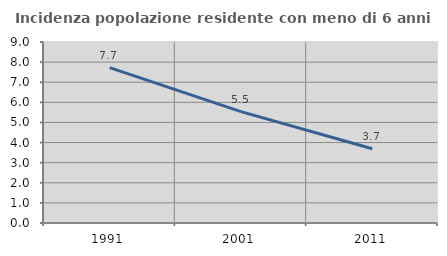
| Category | Incidenza popolazione residente con meno di 6 anni |
|---|---|
| 1991.0 | 7.725 |
| 2001.0 | 5.539 |
| 2011.0 | 3.691 |